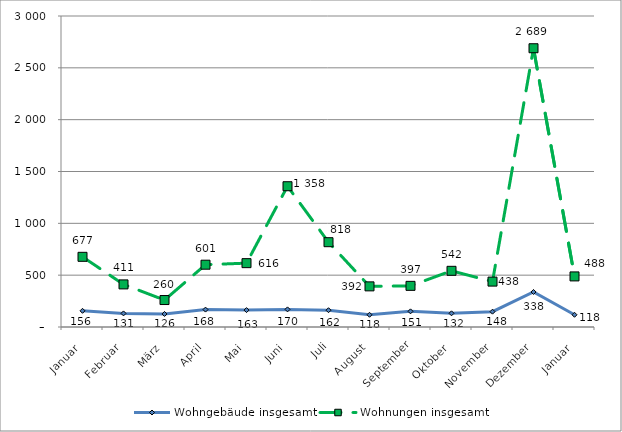
| Category | Wohngebäude insgesamt | Wohnungen insgesamt |
|---|---|---|
| Januar | 156 | 677 |
| Februar | 131 | 411 |
| März | 126 | 260 |
| April | 168 | 601 |
| Mai | 163 | 616 |
| Juni | 170 | 1358 |
| Juli | 162 | 818 |
| August | 118 | 392 |
| September | 151 | 397 |
| Oktober | 132 | 542 |
| November | 148 | 438 |
| Dezember | 338 | 2689 |
| Januar | 118 | 488 |